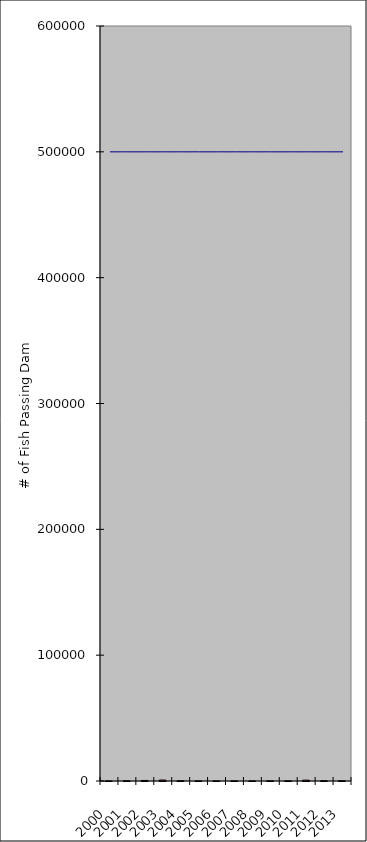
| Category | fish passed |
|---|---|
| 2000.0 | 16 |
| 2001.0 | 133 |
| 2002.0 | 437 |
| 2003.0 | 751 |
| 2004.0 | 174 |
| 2005.0 | 79 |
| 2006.0 | 46 |
| 2007.0 | 84 |
| 2008.0 | 43 |
| 2009.0 | 100 |
| 2010.0 | 116 |
| 2011.0 | 669 |
| 2012.0 | 184 |
| 2013.0 | 192 |